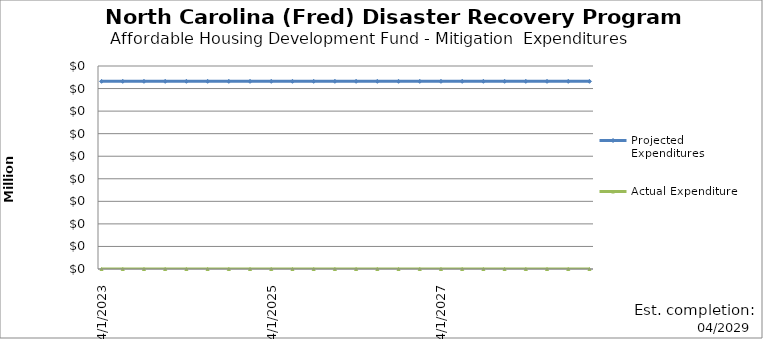
| Category | Projected Expenditures | Actual Expenditure |
|---|---|---|
| 4/1/23 | 41600 | 0 |
| 7/1/23 | 41600 | 0 |
| 10/1/23 | 41600 | 0 |
| 1/1/24 | 41600 | 0 |
| 4/1/24 | 41600 | 0 |
| 7/1/24 | 41600 | 0 |
| 10/1/24 | 41600 | 0 |
| 1/1/25 | 41600 | 0 |
| 4/1/25 | 41600 | 0 |
| 7/1/25 | 41600 | 0 |
| 10/1/25 | 41600 | 0 |
| 1/1/26 | 41600 | 0 |
| 4/1/26 | 41600 | 0 |
| 7/1/26 | 41600 | 0 |
| 10/1/26 | 41600 | 0 |
| 1/1/27 | 41600 | 0 |
| 4/1/27 | 41600 | 0 |
| 7/1/27 | 41600 | 0 |
| 10/1/27 | 41600 | 0 |
| 1/1/28 | 41600 | 0 |
| 4/1/28 | 41600 | 0 |
| 7/1/28 | 41600 | 0 |
| 10/1/28 | 41600 | 0 |
| 1/1/29 | 41600 | 0 |